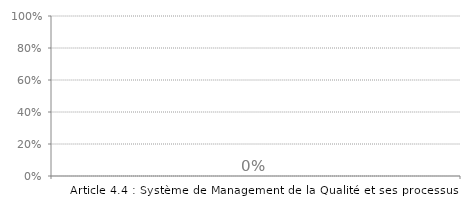
| Category | Article 4 |
|---|---|
| Article 4.4 : Système de Management de la Qualité et ses processus | 0 |